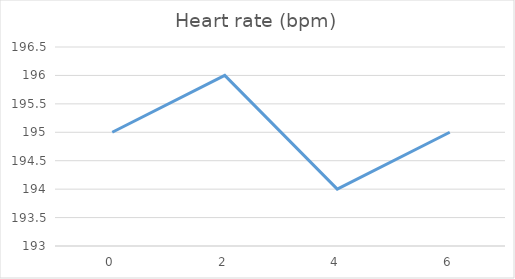
| Category | Heart rate (bpm) |
|---|---|
| 0.0 | 195 |
| 2.0 | 196 |
| 4.0 | 194 |
| 6.0 | 195 |